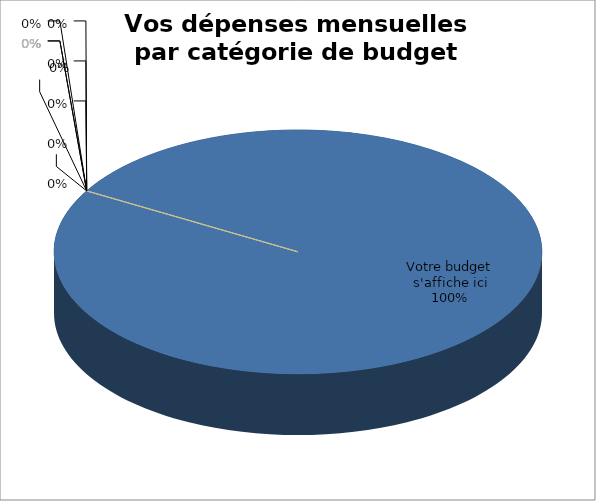
| Category | Series 0 |
|---|---|
| Votre budget s'affiche ici | 1 |
|  | 0 |
|  | 0 |
|  | 0 |
|  | 0 |
|  | 0 |
|                                   | 0 |